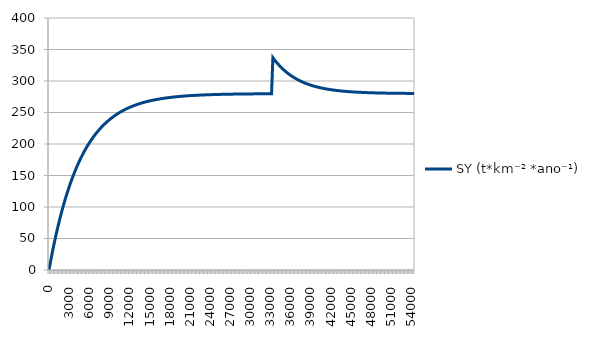
| Category | SY (t*km⁻² *ano⁻¹) |
|---|---|
| 0 | 0 |
| 200 | 11.62 |
| 400 | 22.758 |
| 600 | 33.434 |
| 800 | 43.667 |
| 1000 | 53.475 |
| 1200 | 62.876 |
| 1400 | 71.886 |
| 1600 | 80.523 |
| 1800 | 88.802 |
| 2000 | 96.737 |
| 2200 | 104.342 |
| 2400 | 111.632 |
| 2600 | 118.619 |
| 2800 | 125.317 |
| 3000 | 131.736 |
| 3200 | 137.889 |
| 3400 | 143.787 |
| 3600 | 149.44 |
| 3800 | 154.858 |
| 4000 | 160.052 |
| 4200 | 165.03 |
| 4400 | 169.801 |
| 4600 | 174.374 |
| 4800 | 178.758 |
| 5000 | 182.96 |
| 5200 | 186.987 |
| 5400 | 190.847 |
| 5600 | 194.547 |
| 5800 | 198.093 |
| 6000 | 201.492 |
| 6200 | 204.75 |
| 6400 | 207.873 |
| 6600 | 210.867 |
| 6800 | 213.736 |
| 7000 | 216.486 |
| 7200 | 219.122 |
| 7400 | 221.648 |
| 7600 | 224.07 |
| 7800 | 226.391 |
| 8000 | 228.616 |
| 8200 | 230.748 |
| 8400 | 232.792 |
| 8600 | 234.751 |
| 8800 | 236.629 |
| 9000 | 238.429 |
| 9200 | 240.154 |
| 9400 | 241.808 |
| 9600 | 243.393 |
| 9800 | 244.912 |
| 10000 | 246.368 |
| 10200 | 247.764 |
| 10400 | 249.102 |
| 10600 | 250.384 |
| 10800 | 251.613 |
| 11000 | 252.791 |
| 11200 | 253.921 |
| 11400 | 255.003 |
| 11600 | 256.04 |
| 11800 | 257.035 |
| 12000 | 257.988 |
| 12200 | 258.901 |
| 12400 | 259.777 |
| 12600 | 260.616 |
| 12800 | 261.421 |
| 13000 | 262.192 |
| 13200 | 262.931 |
| 13400 | 263.639 |
| 13600 | 264.318 |
| 13800 | 264.969 |
| 14000 | 265.593 |
| 14200 | 266.191 |
| 14400 | 266.764 |
| 14600 | 267.313 |
| 14800 | 267.84 |
| 15000 | 268.344 |
| 15200 | 268.828 |
| 15400 | 269.292 |
| 15600 | 269.736 |
| 15800 | 270.162 |
| 16000 | 270.57 |
| 16200 | 270.962 |
| 16400 | 271.337 |
| 16600 | 271.696 |
| 16800 | 272.041 |
| 17000 | 272.371 |
| 17200 | 272.688 |
| 17400 | 272.991 |
| 17600 | 273.282 |
| 17800 | 273.561 |
| 18000 | 273.828 |
| 18200 | 274.084 |
| 18400 | 274.33 |
| 18600 | 274.565 |
| 18800 | 274.791 |
| 19000 | 275.007 |
| 19200 | 275.214 |
| 19400 | 275.413 |
| 19600 | 275.603 |
| 19800 | 275.786 |
| 20000 | 275.96 |
| 20200 | 276.128 |
| 20400 | 276.289 |
| 20600 | 276.443 |
| 20800 | 276.59 |
| 21000 | 276.732 |
| 21200 | 276.868 |
| 21400 | 276.998 |
| 21600 | 277.122 |
| 21800 | 277.242 |
| 22000 | 277.356 |
| 22200 | 277.466 |
| 22400 | 277.571 |
| 22600 | 277.672 |
| 22800 | 277.768 |
| 23000 | 277.861 |
| 23200 | 277.95 |
| 23400 | 278.035 |
| 23600 | 278.116 |
| 23800 | 278.195 |
| 24000 | 278.269 |
| 24200 | 278.341 |
| 24400 | 278.41 |
| 24600 | 278.476 |
| 24800 | 278.539 |
| 25000 | 278.6 |
| 25200 | 278.658 |
| 25400 | 278.714 |
| 25600 | 278.767 |
| 25800 | 278.818 |
| 26000 | 278.867 |
| 26200 | 278.914 |
| 26400 | 278.959 |
| 26600 | 279.003 |
| 26800 | 279.044 |
| 27000 | 279.084 |
| 27200 | 279.122 |
| 27400 | 279.158 |
| 27600 | 279.193 |
| 27800 | 279.227 |
| 28000 | 279.259 |
| 28200 | 279.289 |
| 28400 | 279.319 |
| 28600 | 279.347 |
| 28800 | 279.374 |
| 29000 | 279.4 |
| 29200 | 279.425 |
| 29400 | 279.449 |
| 29600 | 279.472 |
| 29800 | 279.494 |
| 30000 | 279.515 |
| 30200 | 279.535 |
| 30400 | 279.554 |
| 30600 | 279.573 |
| 30800 | 279.59 |
| 31000 | 279.607 |
| 31200 | 279.624 |
| 31400 | 279.639 |
| 31600 | 279.654 |
| 31800 | 279.669 |
| 32000 | 279.682 |
| 32200 | 279.696 |
| 32400 | 279.708 |
| 32600 | 279.72 |
| 32800 | 279.732 |
| 33000 | 279.743 |
| 33200 | 279.754 |
| 33400 | 337.059 |
| 33600 | 334.206 |
| 33800 | 331.496 |
| 34000 | 328.921 |
| 34200 | 326.475 |
| 34400 | 324.151 |
| 34600 | 321.944 |
| 34800 | 319.847 |
| 35000 | 317.854 |
| 35200 | 315.962 |
| 35400 | 314.163 |
| 35600 | 312.455 |
| 35800 | 310.833 |
| 36000 | 309.291 |
| 36200 | 307.826 |
| 36400 | 306.435 |
| 36600 | 305.113 |
| 36800 | 303.858 |
| 37000 | 302.665 |
| 37200 | 301.531 |
| 37400 | 300.455 |
| 37600 | 299.432 |
| 37800 | 298.461 |
| 38000 | 297.538 |
| 38200 | 296.661 |
| 38400 | 295.828 |
| 38600 | 295.036 |
| 38800 | 294.284 |
| 39000 | 293.57 |
| 39200 | 292.892 |
| 39400 | 292.247 |
| 39600 | 291.635 |
| 39800 | 291.053 |
| 40000 | 290.5 |
| 40200 | 289.975 |
| 40400 | 289.477 |
| 40600 | 289.003 |
| 40800 | 288.553 |
| 41000 | 288.125 |
| 41200 | 287.719 |
| 41400 | 287.333 |
| 41600 | 286.966 |
| 41800 | 286.618 |
| 42000 | 286.287 |
| 42200 | 285.973 |
| 42400 | 285.674 |
| 42600 | 285.39 |
| 42800 | 285.121 |
| 43000 | 284.865 |
| 43200 | 284.621 |
| 43400 | 284.39 |
| 43600 | 284.171 |
| 43800 | 283.962 |
| 44000 | 283.764 |
| 44200 | 283.576 |
| 44400 | 283.397 |
| 44600 | 283.227 |
| 44800 | 283.066 |
| 45000 | 282.913 |
| 45200 | 282.767 |
| 45400 | 282.629 |
| 45600 | 282.497 |
| 45800 | 282.372 |
| 46000 | 282.254 |
| 46200 | 282.141 |
| 46400 | 282.034 |
| 46600 | 281.932 |
| 46800 | 281.836 |
| 47000 | 281.744 |
| 47200 | 281.657 |
| 47400 | 281.574 |
| 47600 | 281.495 |
| 47800 | 281.42 |
| 48000 | 281.349 |
| 48200 | 281.282 |
| 48400 | 281.218 |
| 48600 | 281.157 |
| 48800 | 281.099 |
| 49000 | 281.044 |
| 49200 | 280.992 |
| 49400 | 280.942 |
| 49600 | 280.895 |
| 49800 | 280.85 |
| 50000 | 280.808 |
| 50200 | 280.768 |
| 50400 | 280.729 |
| 50600 | 280.693 |
| 50800 | 280.658 |
| 51000 | 280.625 |
| 51200 | 280.594 |
| 51400 | 280.564 |
| 51600 | 280.536 |
| 51800 | 280.509 |
| 52000 | 280.484 |
| 52200 | 280.46 |
| 52400 | 280.437 |
| 52600 | 280.415 |
| 52800 | 280.394 |
| 53000 | 280.374 |
| 53200 | 280.356 |
| 53400 | 280.338 |
| 53600 | 280.321 |
| 53800 | 280.305 |
| 54000 | 280.29 |
| 54200 | 280.275 |
| 54400 | 280.261 |
| 54600 | 280.248 |